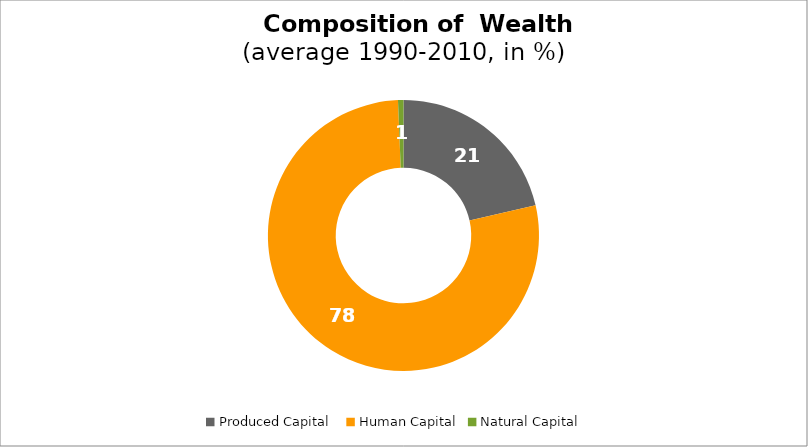
| Category | Series 0 |
|---|---|
| Produced Capital  | 21.422 |
| Human Capital | 77.927 |
| Natural Capital | 0.652 |